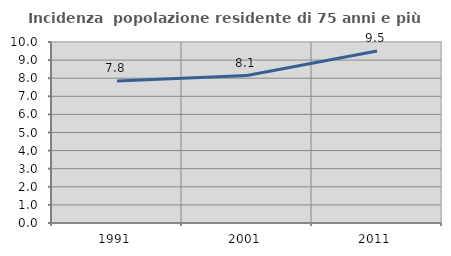
| Category | Incidenza  popolazione residente di 75 anni e più |
|---|---|
| 1991.0 | 7.849 |
| 2001.0 | 8.146 |
| 2011.0 | 9.5 |